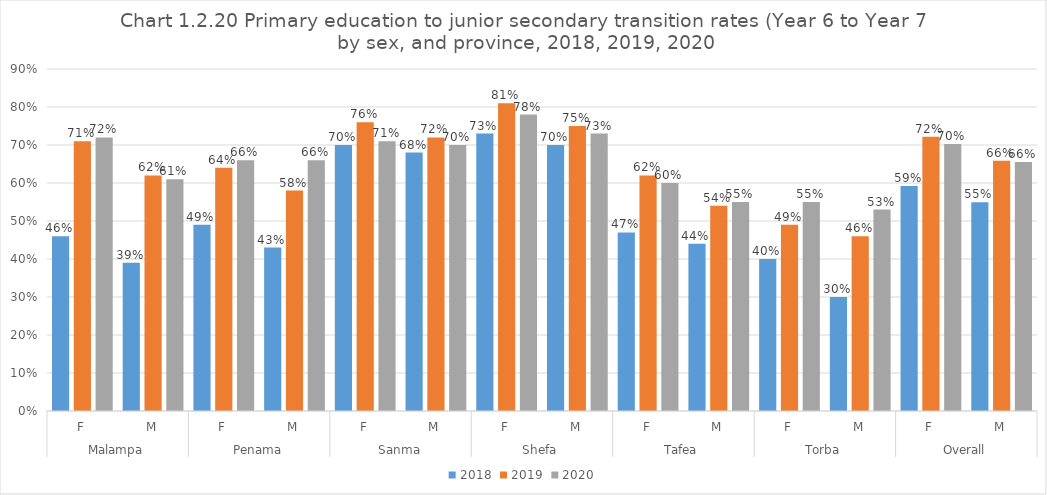
| Category | 2018 | 2019 | 2020 |
|---|---|---|---|
| 0 | 0.46 | 0.71 | 0.72 |
| 1 | 0.39 | 0.62 | 0.61 |
| 2 | 0.49 | 0.64 | 0.66 |
| 3 | 0.43 | 0.58 | 0.66 |
| 4 | 0.7 | 0.76 | 0.71 |
| 5 | 0.68 | 0.72 | 0.7 |
| 6 | 0.73 | 0.81 | 0.78 |
| 7 | 0.7 | 0.75 | 0.73 |
| 8 | 0.47 | 0.62 | 0.6 |
| 9 | 0.44 | 0.54 | 0.55 |
| 10 | 0.4 | 0.49 | 0.55 |
| 11 | 0.3 | 0.46 | 0.53 |
| 12 | 0.592 | 0.722 | 0.703 |
| 13 | 0.549 | 0.659 | 0.655 |